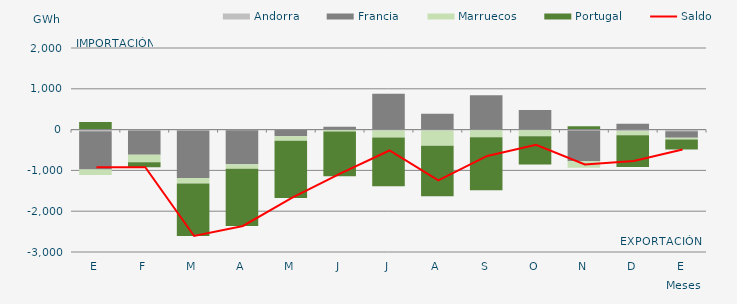
| Category | Andorra | Francia | Marruecos | Portugal |
|---|---|---|---|---|
| E | -42.454 | -936.901 | -131.692 | 188.334 |
| F | -21.206 | -592.499 | -187.112 | -122.026 |
| M | -23.108 | -1163.333 | -133.704 | -1286.701 |
| A | -14.627 | -836.505 | -105.478 | -1404.431 |
| M | -10.909 | -149.423 | -115.706 | -1398.852 |
| J | -2.08 | 70.4 | -42.701 | -1096.73 |
| J | -19.231 | 877.054 | -174.716 | -1194.709 |
| A | -19.938 | 386.697 | -376.794 | -1234.348 |
| S | -15.222 | 839.308 | -170.976 | -1297.757 |
| O | -13.493 | 479.877 | -148.522 | -692.604 |
| N | -23.834 | -750.522 | -163.216 | 84.596 |
| D | -34.648 | 145.481 | -106.176 | -774.962 |
| E | -40.623 | -161.618 | -38.221 | -248.586 |